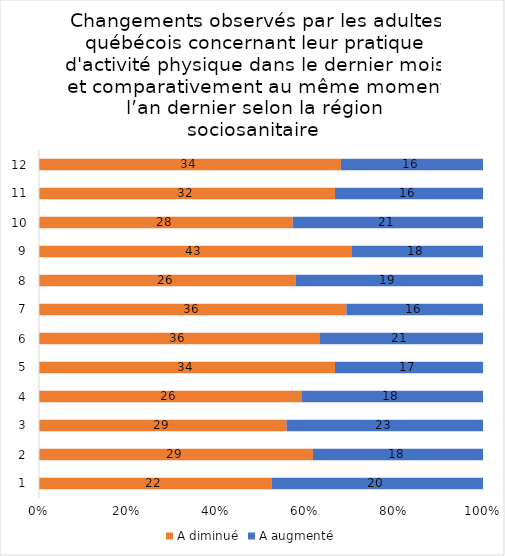
| Category | A diminué | A augmenté |
|---|---|---|
| 0 | 22 | 20 |
| 1 | 29 | 18 |
| 2 | 29 | 23 |
| 3 | 26 | 18 |
| 4 | 34 | 17 |
| 5 | 36 | 21 |
| 6 | 36 | 16 |
| 7 | 26 | 19 |
| 8 | 43 | 18 |
| 9 | 28 | 21 |
| 10 | 32 | 16 |
| 11 | 34 | 16 |